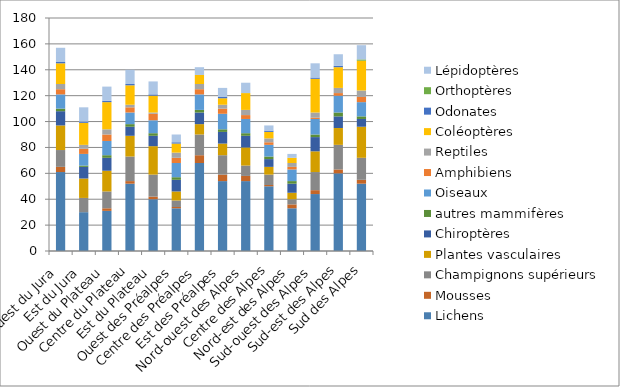
| Category | Lichens | Mousses | Champignons supérieurs | Plantes vasculaires | Chiroptères | autres mammifères | Oiseaux | Amphibiens | Reptiles | Coléoptères | Odonates | Orthoptères | Lépidoptères |
|---|---|---|---|---|---|---|---|---|---|---|---|---|---|
| Ouest du Jura | 61 | 4 | 13 | 19 | 11 | 2 | 11 | 4 | 4 | 16 | 1 | 0 | 11 |
| Est du Jura | 30 | 0 | 11 | 15 | 9 | 1 | 9 | 4 | 3 | 17 | 1 | 0 | 11 |
| Ouest du Plateau | 31 | 2 | 13 | 16 | 10 | 2 | 11 | 5 | 4 | 21 | 1 | 0 | 11 |
| Centre du Plateau | 52 | 2 | 19 | 16 | 7 | 2 | 9 | 4 | 2 | 15 | 1 | 0 | 11 |
| Est du Plateau | 40 | 2 | 17 | 22 | 8 | 2 | 10 | 5 | 1 | 13 | 1 | 0 | 10 |
| Ouest des Préalpes | 33 | 1 | 5 | 7 | 9 | 2 | 11 | 4 | 4 | 7 | 1 | 0 | 6 |
| Centre des Préalpes | 68 | 6 | 16 | 8 | 9 | 2 | 12 | 4 | 4 | 7 | 0 | 0 | 6 |
| Est des Préalpes | 54 | 5 | 15 | 9 | 9 | 2 | 12 | 4 | 3 | 5 | 1 | 0 | 7 |
| Nord-ouest des Alpes | 54 | 4 | 8 | 14 | 9 | 2 | 11 | 3 | 4 | 13 | 0 | 0 | 8 |
| Centre des Alpes | 50 | 1 | 8 | 6 | 6 | 2 | 9 | 2 | 3 | 5 | 1 | 0 | 4 |
| Nord-est des Alpes | 33 | 3 | 4 | 5 | 7 | 2 | 9 | 2 | 3 | 4 | 0 | 0 | 3 |
| Sud-ouest des Alpes | 44 | 3 | 14 | 16 | 11 | 2 | 12 | 1 | 4 | 26 | 1 | 0 | 11 |
| Sud-est des Alpes | 60 | 3 | 19 | 13 | 9 | 3 | 13 | 2 | 4 | 16 | 1 | 0 | 9 |
| Sud des Alpes | 52 | 3 | 17 | 24 | 6 | 2 | 11 | 4 | 5 | 23 | 0 | 1 | 11 |